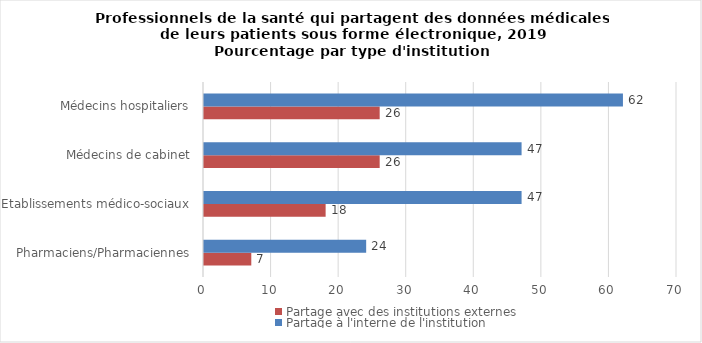
| Category | Partage avec des institutions externes | Partage à l'interne de l'institution |
|---|---|---|
| Pharmaciens/Pharmaciennes | 7 | 24 |
| Etablissements médico-sociaux | 18 | 47 |
| Médecins de cabinet | 26 | 47 |
| Médecins hospitaliers | 26 | 62 |